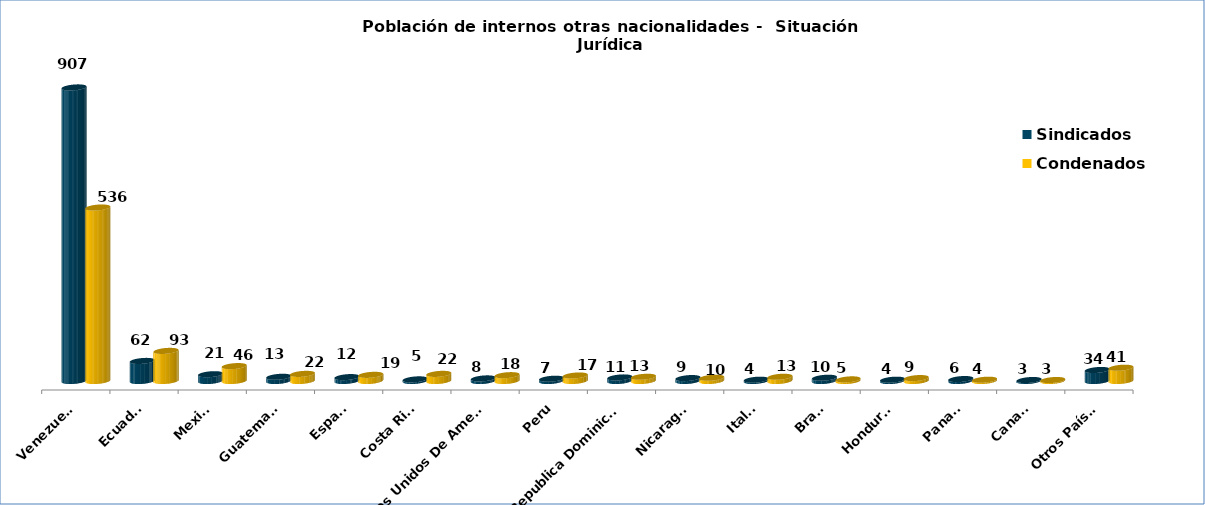
| Category | Sindicados | Condenados |
|---|---|---|
| Venezuela | 907 | 536 |
| Ecuador | 62 | 93 |
| Mexico | 21 | 46 |
| Guatemala | 13 | 22 |
| Espana | 12 | 19 |
| Costa Rica | 5 | 22 |
| Estados Unidos De America | 8 | 18 |
| Peru | 7 | 17 |
| Republica Dominicana | 11 | 13 |
| Nicaragua | 9 | 10 |
| Italia | 4 | 13 |
| Brasil | 10 | 5 |
| Honduras | 4 | 9 |
| Panama | 6 | 4 |
| Canada | 3 | 3 |
| Otros Países | 34 | 41 |